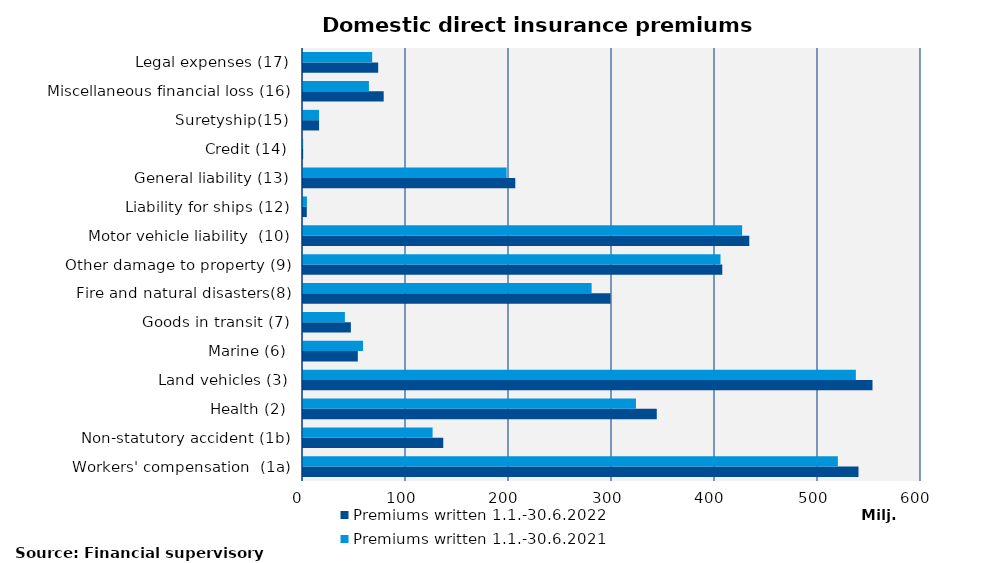
| Category | Premiums written |
|---|---|
| Workers' compensation  (1a) | 519287.794 |
| Non-statutory accident (1b) | 125804.516 |
| Health (2) | 323263.784 |
| Land vehicles (3) | 536756.735 |
| Marine (6) | 58273.936 |
| Goods in transit (7) | 40669.453 |
| Fire and natural disasters(8) | 280218.114 |
| Other damage to property (9) | 405337.963 |
| Motor vehicle liability  (10) | 426312.893 |
| Liability for ships (12) | 3808.364 |
| General liability (13) | 197728.066 |
| Credit (14) | 148.165 |
| Suretyship(15) | 15512.136 |
| Miscellaneous financial loss (16) | 64006.947 |
| Legal expenses (17) | 67164.273 |